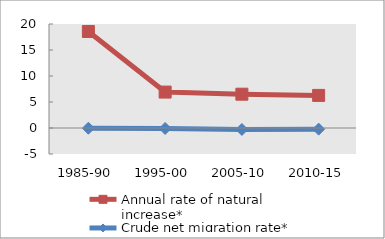
| Category | Annual rate of natural increase* | Crude net migration rate* |
|---|---|---|
| 1985-90 | 18.56 | -0.042 |
| 1995-00 | 6.911 | -0.096 |
| 2005-10 | 6.501 | -0.281 |
| 2010-15 | 6.267 | -0.217 |